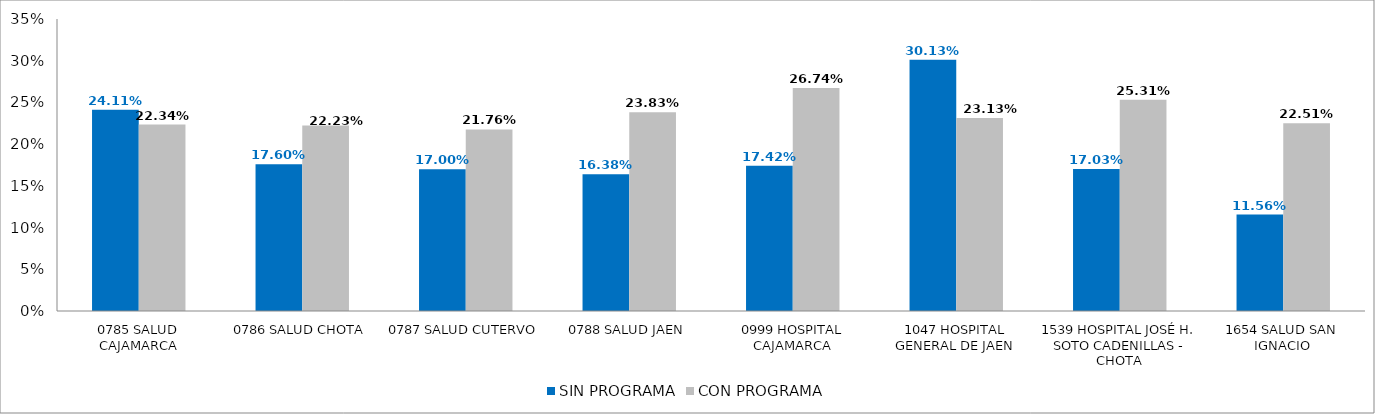
| Category | SIN PROGRAMA | CON PROGRAMA |
|---|---|---|
| 0785 SALUD CAJAMARCA | 0.241 | 0.223 |
| 0786 SALUD CHOTA | 0.176 | 0.222 |
| 0787 SALUD CUTERVO | 0.17 | 0.218 |
| 0788 SALUD JAEN | 0.164 | 0.238 |
| 0999 HOSPITAL CAJAMARCA | 0.174 | 0.267 |
| 1047 HOSPITAL GENERAL DE JAEN | 0.301 | 0.231 |
| 1539 HOSPITAL JOSÉ H. SOTO CADENILLAS - CHOTA | 0.17 | 0.253 |
| 1654 SALUD SAN IGNACIO | 0.116 | 0.225 |